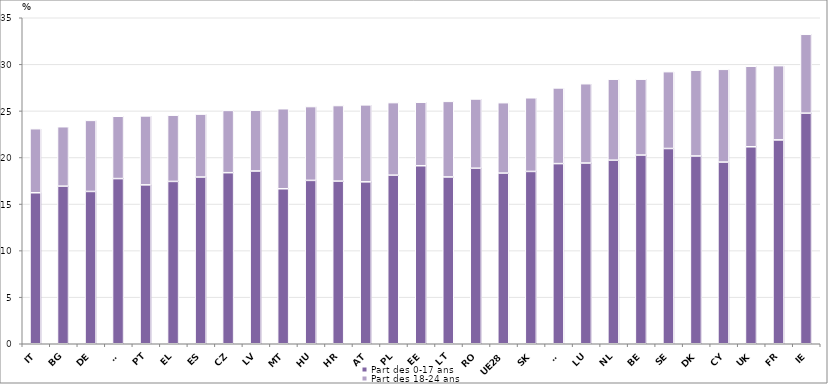
| Category | Part des 0-17 ans | Part des 18-24 ans |
|---|---|---|
| IT | 16.213 | 6.875 |
| BG | 16.918 | 6.381 |
| DE | 16.352 | 7.63 |
| SI | 17.733 | 6.69 |
| PT | 17.058 | 7.401 |
| EL | 17.429 | 7.11 |
| ES | 17.9 | 6.755 |
| CZ | 18.368 | 6.684 |
| LV | 18.547 | 6.532 |
| MT | 16.641 | 8.592 |
| HU | 17.54 | 7.924 |
| HR | 17.46 | 8.115 |
| AT | 17.383 | 8.266 |
| PL | 18.101 | 7.789 |
| EE | 19.112 | 6.813 |
| LT | 17.908 | 8.114 |
| RO | 18.847 | 7.431 |
| UE28 | 18.321 | 7.561 |
| SK | 18.5 | 7.909 |
| FI | 19.34 | 8.126 |
| LU | 19.403 | 8.516 |
| NL | 19.708 | 8.692 |
| BE | 20.259 | 8.144 |
| SE | 20.964 | 8.249 |
| DK | 20.16 | 9.213 |
| CY | 19.506 | 9.958 |
| UK | 21.149 | 8.644 |
| FR | 21.888 | 7.97 |
| IE | 24.757 | 8.468 |